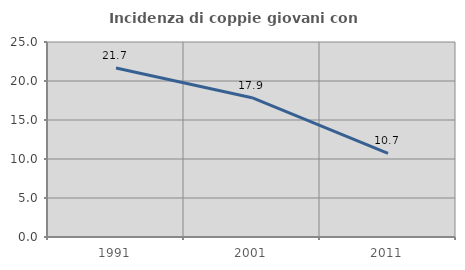
| Category | Incidenza di coppie giovani con figli |
|---|---|
| 1991.0 | 21.662 |
| 2001.0 | 17.857 |
| 2011.0 | 10.716 |